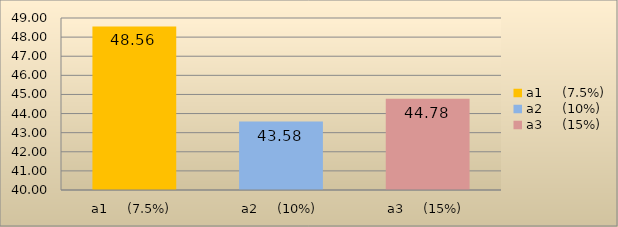
| Category | Konsentrasi Tepung Kacang Koro (A) |
|---|---|
| a1     (7.5%) | 48.556 |
| a2     (10%) | 43.578 |
| a3     (15%) | 44.778 |